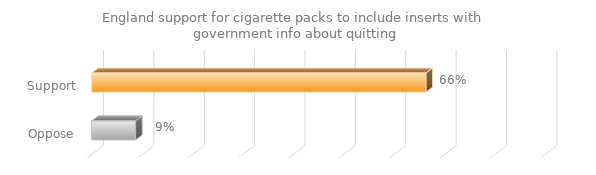
| Category | England support for cigarette packs to include inserts with government info about quitting |
|---|---|
| Support | 0.664 |
| Oppose | 0.087 |